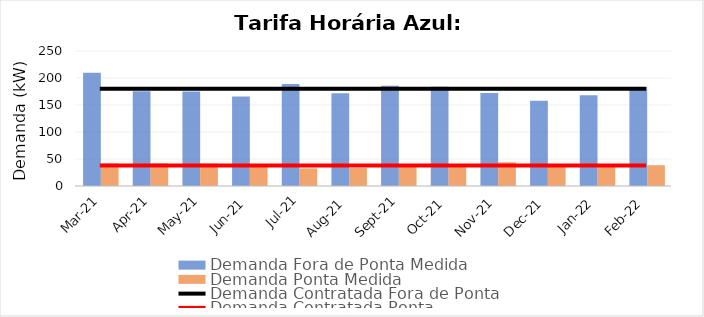
| Category | Demanda Fora de Ponta Medida | Demanda Ponta Medida |
|---|---|---|
| 2022-02-01 | 183.516 | 38.54 |
| 2022-01-01 | 167.936 | 39.36 |
| 2021-12-01 | 158.096 | 38.54 |
| 2021-11-01 | 172.036 | 43.952 |
| 2021-10-01 | 183.68 | 34.932 |
| 2021-09-01 | 185.484 | 37.884 |
| 2021-08-01 | 171.544 | 33.456 |
| 2021-07-01 | 188.928 | 32.636 |
| 2021-06-01 | 165.968 | 35.588 |
| 2021-05-01 | 174.824 | 41.656 |
| 2021-04-01 | 175.48 | 41.82 |
| 2021-03-01 | 209.756 | 41.82 |